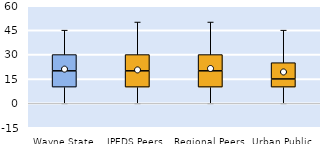
| Category | 25th | 50th | 75th |
|---|---|---|---|
| Wayne State | 10 | 10 | 10 |
| IPEDS Peers | 10 | 10 | 10 |
| Regional Peers | 10 | 10 | 10 |
| Urban Public | 10 | 5 | 10 |